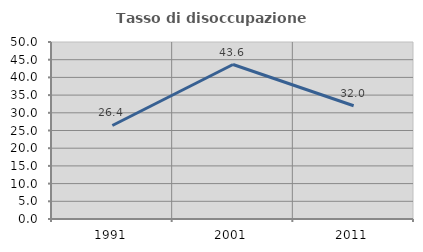
| Category | Tasso di disoccupazione giovanile  |
|---|---|
| 1991.0 | 26.415 |
| 2001.0 | 43.636 |
| 2011.0 | 32 |